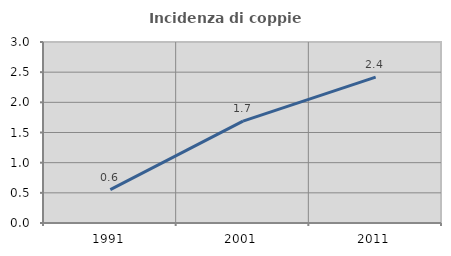
| Category | Incidenza di coppie miste |
|---|---|
| 1991.0 | 0.552 |
| 2001.0 | 1.688 |
| 2011.0 | 2.419 |